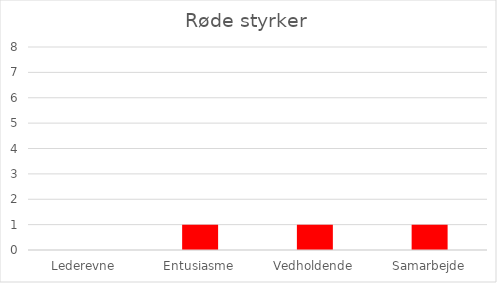
| Category | Series 0 |
|---|---|
| Lederevne | 0 |
| Entusiasme | 1 |
| Vedholdende | 1 |
| Samarbejde | 1 |